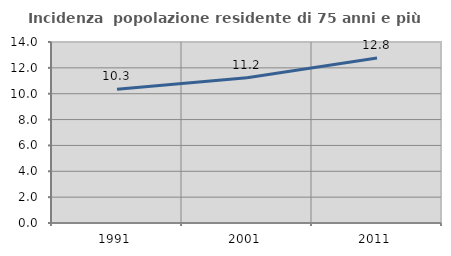
| Category | Incidenza  popolazione residente di 75 anni e più |
|---|---|
| 1991.0 | 10.338 |
| 2001.0 | 11.227 |
| 2011.0 | 12.756 |